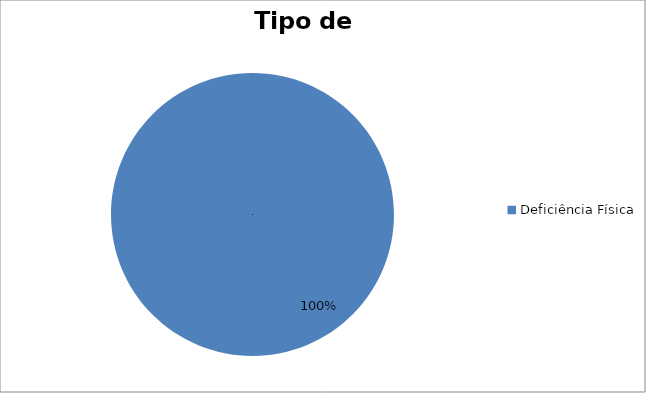
| Category | Quantitativo |
|---|---|
| Deficiência Física | 1 |